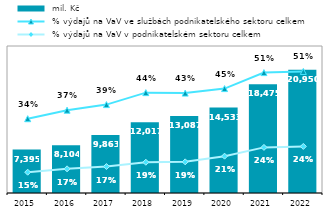
| Category |  mil. Kč |
|---|---|
| 2015.0 | 7394.736 |
| 2016.0 | 8103.91 |
| 2017.0 | 9863.017 |
| 2018.0 | 12016.964 |
| 2019.0 | 13086.503 |
| 2020.0 | 14532.76 |
| 2021.0 | 18475.41 |
| 2022.0 | 20950.168 |